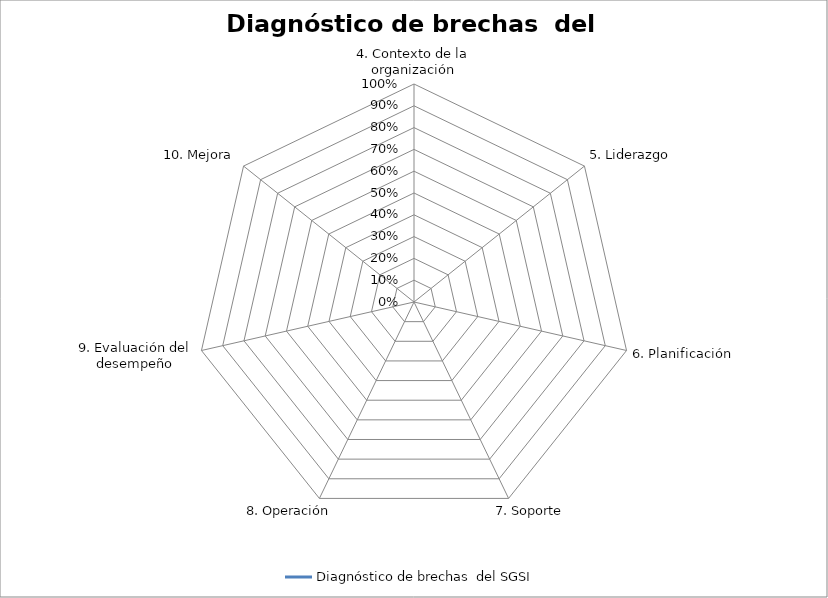
| Category | Diagnóstico de brechas  del SGSI |
|---|---|
| 4. Contexto de la organización | 0 |
| 5. Liderazgo | 0 |
| 6. Planificación | 0 |
| 7. Soporte | 0 |
| 8. Operación | 0 |
| 9. Evaluación del desempeño | 0 |
| 10. Mejora | 0 |